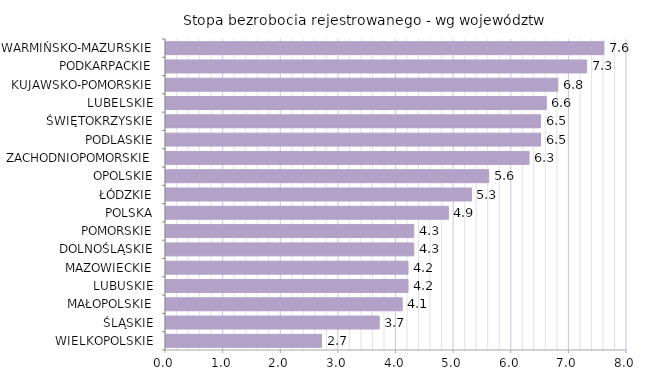
| Category | Stopa bezrobocia rejestrowanego - wg województw |
|---|---|
| WIELKOPOLSKIE | 2.7 |
| ŚLĄSKIE | 3.7 |
| MAŁOPOLSKIE | 4.1 |
| LUBUSKIE | 4.2 |
| MAZOWIECKIE | 4.2 |
| DOLNOŚLĄSKIE | 4.3 |
| POMORSKIE | 4.3 |
| POLSKA | 4.9 |
| ŁÓDZKIE | 5.3 |
| OPOLSKIE | 5.6 |
| ZACHODNIOPOMORSKIE | 6.3 |
| PODLASKIE | 6.5 |
| ŚWIĘTOKRZYSKIE | 6.5 |
| LUBELSKIE | 6.6 |
| KUJAWSKO-POMORSKIE | 6.8 |
| PODKARPACKIE | 7.3 |
| WARMIŃSKO-MAZURSKIE | 7.6 |